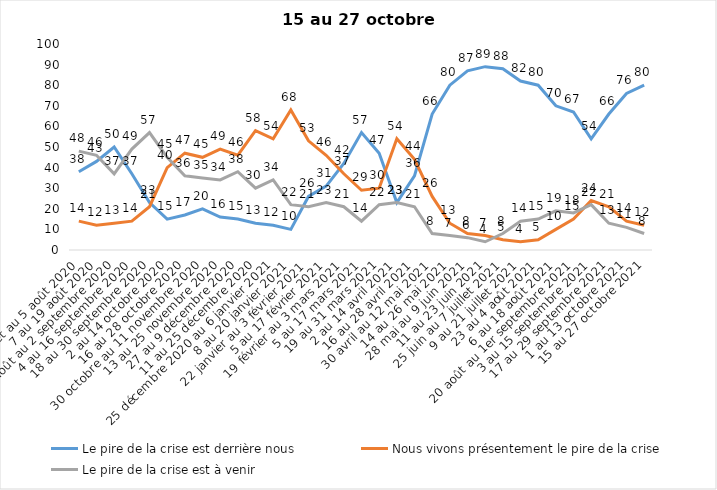
| Category | Le pire de la crise est derrière nous | Nous vivons présentement le pire de la crise | Le pire de la crise est à venir |
|---|---|---|---|
| 24 juillet au 5 août 2020 | 38 | 14 | 48 |
| 7 au 19 août 2020 | 43 | 12 | 46 |
| 21 août au 2 septembre 2020 | 50 | 13 | 37 |
| 4 au 16 septembre 2020 | 37 | 14 | 49 |
| 18 au 30 septembre 2020 | 23 | 21 | 57 |
| 2 au 14 octobre 2020 | 15 | 40 | 45 |
| 16 au 28 octobre 2020 | 17 | 47 | 36 |
| 30 octobre au 11 novembre 2020 | 20 | 45 | 35 |
| 13 au 25 novembre 2020 | 16 | 49 | 34 |
| 27 au 9 décembre 2020 | 15 | 46 | 38 |
| 11 au 25 décembre 2020 | 13 | 58 | 30 |
| 25 décembre 2020 au 6 janvier 2021 | 12 | 54 | 34 |
| 8 au 20 janvier 2021 | 10 | 68 | 22 |
| 22 janvier au 3 février 2021 | 26 | 53 | 21 |
| 5 au 17 février 2021 | 31 | 46 | 23 |
| 19 février au 3 mars 2021 | 42 | 37 | 21 |
| 5 au 17 mars 2021 | 57 | 29 | 14 |
| 19 au 31 mars 2021 | 47 | 30 | 22 |
| 2 au 14 avril 2021 | 23 | 54 | 23 |
| 16 au 28 avril 2021 | 36 | 44 | 21 |
| 30 avril au 12 mai 2021 | 66 | 26 | 8 |
| 14 au 26 mai 2021 | 80 | 13 | 7 |
| 28 mai au 9 juin 2021 | 87 | 8 | 6 |
| 11 au 23 juin 2021 | 89 | 7 | 4 |
| 25 juin au 7 juillet 2021 | 88 | 5 | 8 |
| 9 au 21 juillet 2021 | 82 | 4 | 14 |
| 23 au 4 août 2021 | 80 | 5 | 15 |
| 6 au 18 août 2021 | 70 | 10 | 19 |
| 20 août au 1er septembre 2021 | 67 | 15 | 18 |
| 3 au 15 septembre 2021 | 54 | 24 | 22 |
| 17 au 29 septembre 2021 | 66 | 21 | 13 |
| 1 au 13 octobre 2021 | 76 | 14 | 11 |
| 15 au 27 octobre 2021 | 80 | 12 | 8 |